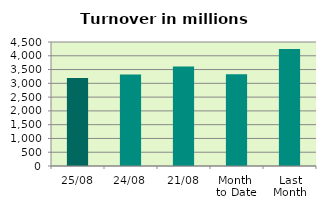
| Category | Series 0 |
|---|---|
| 25/08 | 3197.742 |
| 24/08 | 3321.093 |
| 21/08 | 3609.242 |
| Month 
to Date | 3327.542 |
| Last
Month | 4246.231 |